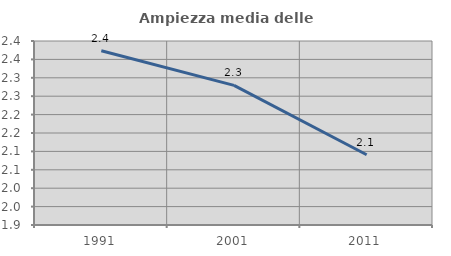
| Category | Ampiezza media delle famiglie |
|---|---|
| 1991.0 | 2.373 |
| 2001.0 | 2.279 |
| 2011.0 | 2.091 |